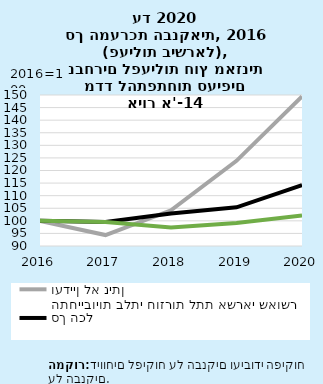
| Category | התחייבויות בלתי חוזרות לתת אשראי שאושר ועדיין לא ניתן | סך הכל | ערבויות לרוכשי דירות |
|---|---|---|---|
| 2016-12-31 | 100 | 100 | 100 |
| 2017-12-31 | 94.348 | 99.525 | 99.562 |
| 2018-12-31 | 104.185 | 102.929 | 97.336 |
| 2019-12-31 | 123.848 | 105.367 | 99.161 |
| 2020-12-31 | 149.433 | 114.199 | 102.161 |